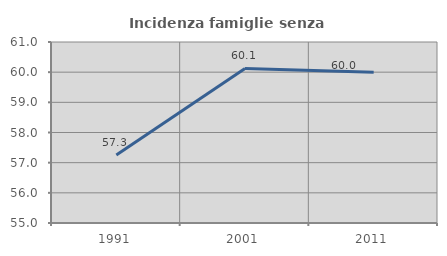
| Category | Incidenza famiglie senza nuclei |
|---|---|
| 1991.0 | 57.252 |
| 2001.0 | 60.123 |
| 2011.0 | 60 |